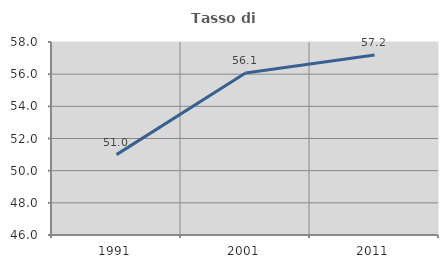
| Category | Tasso di occupazione   |
|---|---|
| 1991.0 | 50.996 |
| 2001.0 | 56.069 |
| 2011.0 | 57.185 |